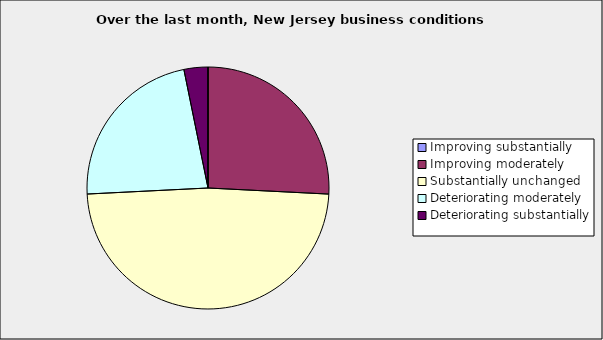
| Category | Series 0 |
|---|---|
| Improving substantially | 0 |
| Improving moderately | 0.258 |
| Substantially unchanged | 0.484 |
| Deteriorating moderately | 0.226 |
| Deteriorating substantially | 0.032 |